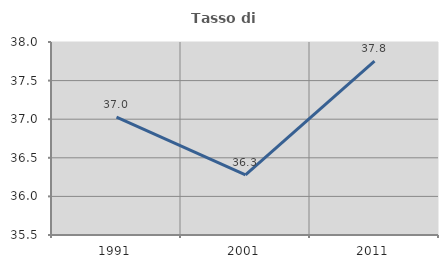
| Category | Tasso di occupazione   |
|---|---|
| 1991.0 | 37.025 |
| 2001.0 | 36.279 |
| 2011.0 | 37.751 |